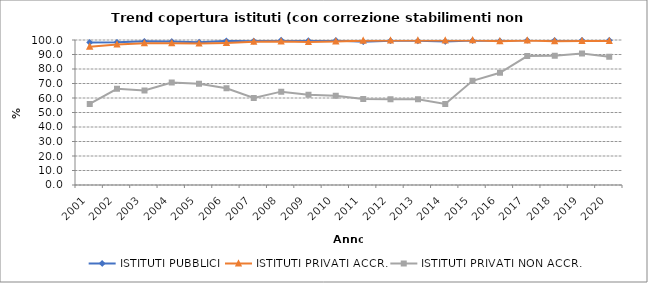
| Category | ISTITUTI PUBBLICI | ISTITUTI PRIVATI ACCR. | ISTITUTI PRIVATI NON ACCR. |
|---|---|---|---|
| 2001 | 98.298 | 95.38 | 55.882 |
| 2002 | 98.406 | 96.875 | 66.304 |
| 2003 | 99.055 | 97.724 | 65.116 |
| 2004 | 98.947 | 97.76 | 70.732 |
| 2005 | 98.478 | 97.508 | 69.863 |
| 2006 | 99.372 | 98.003 | 66.667 |
| 2007 | 99.216 | 98.736 | 60 |
| 2008 | 99.842 | 99.051 | 64.384 |
| 2009 | 99.557 | 98.562 | 62.319 |
| 2010 | 99.671 | 99.038 | 61.538 |
| 2011 | 98.789 | 99.513 | 59.375 |
| 2012 | 99.462 | 99.669 | 59.091 |
| 2013 | 99.448 | 99.668 | 59.091 |
| 2014 | 99.046 | 99.668 | 55.882 |
| 2015 | 99.614 | 99.833 | 71.875 |
| 2016 | 99.419 | 99.142 | 77.419 |
| 2017 | 99.796 | 99.65 | 88.889 |
| 2018 | 99.795 | 99.118 | 89.062 |
| 2019 | 99.794 | 99.292 | 90.769 |
| 2020 | 99.794 | 99.304 | 88.525 |